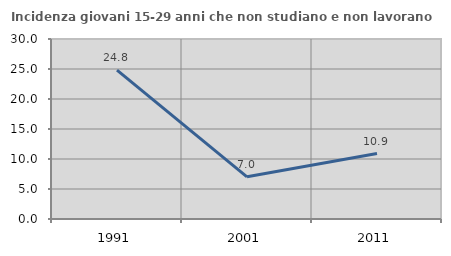
| Category | Incidenza giovani 15-29 anni che non studiano e non lavorano  |
|---|---|
| 1991.0 | 24.8 |
| 2001.0 | 7.031 |
| 2011.0 | 10.909 |